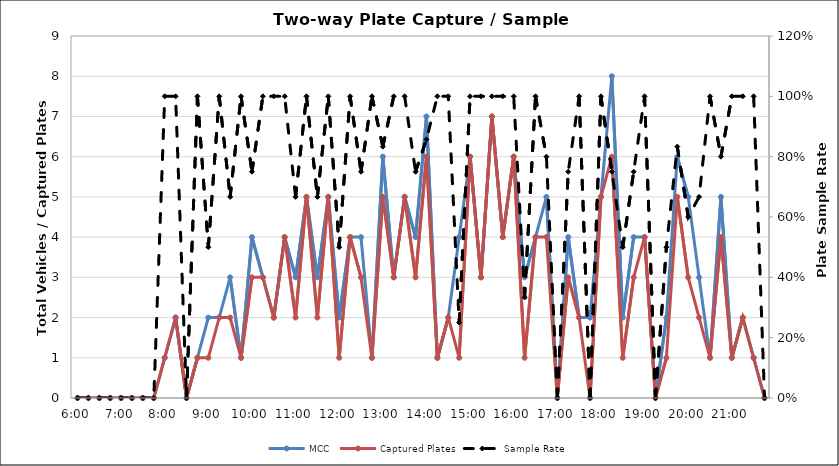
| Category | MCC | Captured Plates |
|---|---|---|
| 0.25 | 0 | 0 |
| 0.260416666666667 | 0 | 0 |
| 0.270833333333333 | 0 | 0 |
| 0.28125 | 0 | 0 |
| 0.291666666666667 | 0 | 0 |
| 0.302083333333333 | 0 | 0 |
| 0.3125 | 0 | 0 |
| 0.322916666666667 | 0 | 0 |
| 0.333333333333333 | 1 | 1 |
| 0.34375 | 2 | 2 |
| 0.354166666666667 | 0 | 0 |
| 0.364583333333333 | 1 | 1 |
| 0.375 | 2 | 1 |
| 0.385416666666667 | 2 | 2 |
| 0.395833333333333 | 3 | 2 |
| 0.40625 | 1 | 1 |
| 0.416666666666667 | 4 | 3 |
| 0.427083333333333 | 3 | 3 |
| 0.4375 | 2 | 2 |
| 0.447916666666667 | 4 | 4 |
| 0.458333333333333 | 3 | 2 |
| 0.46875 | 5 | 5 |
| 0.479166666666667 | 3 | 2 |
| 0.489583333333333 | 5 | 5 |
| 0.5 | 2 | 1 |
| 0.510416666666667 | 4 | 4 |
| 0.520833333333333 | 4 | 3 |
| 0.53125 | 1 | 1 |
| 0.541666666666667 | 6 | 5 |
| 0.552083333333333 | 3 | 3 |
| 0.5625 | 5 | 5 |
| 0.572916666666667 | 4 | 3 |
| 0.583333333333333 | 7 | 6 |
| 0.59375 | 1 | 1 |
| 0.604166666666667 | 2 | 2 |
| 0.614583333333333 | 4 | 1 |
| 0.625 | 6 | 6 |
| 0.635416666666667 | 3 | 3 |
| 0.645833333333333 | 7 | 7 |
| 0.65625 | 4 | 4 |
| 0.666666666666667 | 6 | 6 |
| 0.677083333333333 | 3 | 1 |
| 0.6875 | 4 | 4 |
| 0.697916666666667 | 5 | 4 |
| 0.708333333333333 | 0 | 0 |
| 0.71875 | 4 | 3 |
| 0.729166666666667 | 2 | 2 |
| 0.739583333333333 | 2 | 0 |
| 0.75 | 5 | 5 |
| 0.760416666666667 | 8 | 6 |
| 0.770833333333333 | 2 | 1 |
| 0.78125 | 4 | 3 |
| 0.791666666666667 | 4 | 4 |
| 0.802083333333333 | 0 | 0 |
| 0.8125 | 2 | 1 |
| 0.822916666666667 | 6 | 5 |
| 0.833333333333333 | 5 | 3 |
| 0.84375 | 3 | 2 |
| 0.854166666666667 | 1 | 1 |
| 0.864583333333333 | 5 | 4 |
| 0.875 | 1 | 1 |
| 0.885416666666667 | 2 | 2 |
| 0.895833333333333 | 1 | 1 |
| 0.90625 | 0 | 0 |